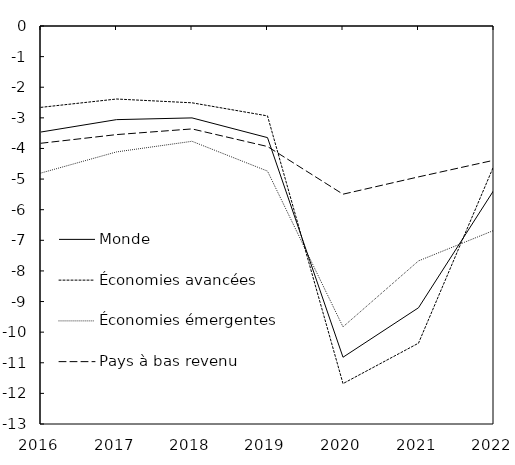
| Category | Monde | Économies avancées | Économies émergentes | Pays à bas revenu |
|---|---|---|---|---|
| 2016.0 | -3.463 | -2.657 | -4.802 | -3.829 |
| 2017.0 | -3.058 | -2.385 | -4.113 | -3.547 |
| 2018.0 | -3.002 | -2.509 | -3.766 | -3.362 |
| 2019.0 | -3.646 | -2.936 | -4.739 | -3.937 |
| 2020.0 | -10.82 | -11.681 | -9.827 | -5.493 |
| 2021.0 | -9.203 | -10.36 | -7.672 | -4.928 |
| 2022.0 | -5.355 | -4.555 | -6.674 | -4.384 |